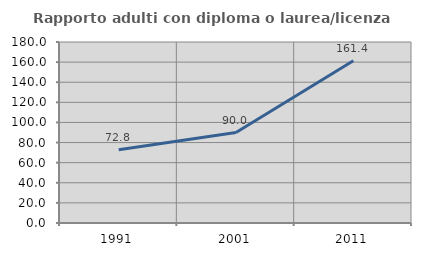
| Category | Rapporto adulti con diploma o laurea/licenza media  |
|---|---|
| 1991.0 | 72.768 |
| 2001.0 | 89.968 |
| 2011.0 | 161.379 |